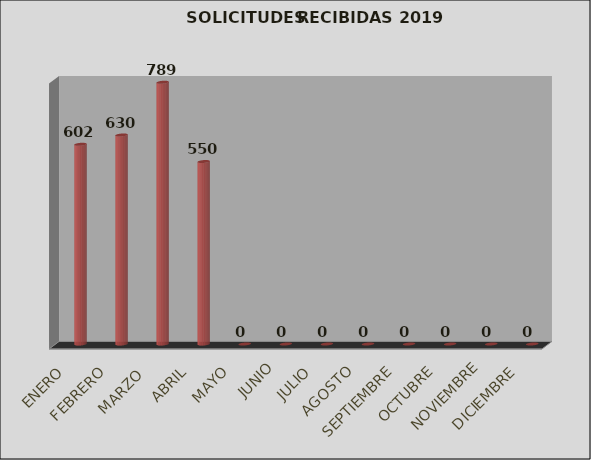
| Category | Series 0 | Series 1 |
|---|---|---|
| ENERO |  | 602 |
| FEBRERO |  | 630 |
| MARZO  |  | 789 |
| ABRIL |  | 550 |
| MAYO |  | 0 |
| JUNIO |  | 0 |
| JULIO |  | 0 |
| AGOSTO |  | 0 |
| SEPTIEMBRE |  | 0 |
| OCTUBRE |  | 0 |
| NOVIEMBRE |  | 0 |
| DICIEMBRE |  | 0 |